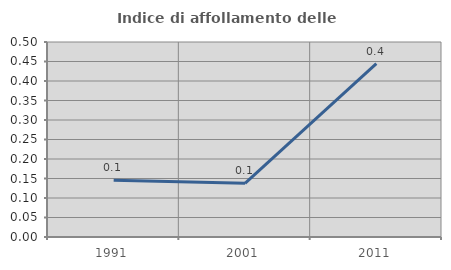
| Category | Indice di affollamento delle abitazioni  |
|---|---|
| 1991.0 | 0.145 |
| 2001.0 | 0.138 |
| 2011.0 | 0.444 |